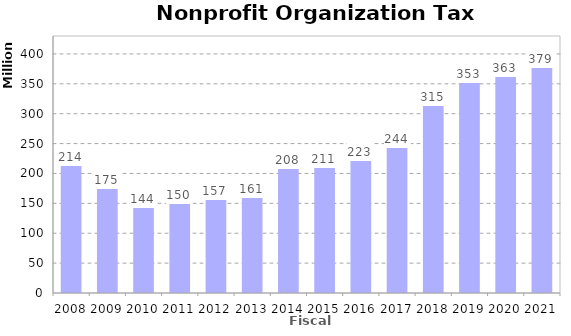
| Category | Amount ($) |
|---|---|
| 2008.0 | 213829116.386 |
| 2009.0 | 175364334.919 |
| 2010.0 | 143554116.648 |
| 2011.0 | 150273915 |
| 2012.0 | 156945693.354 |
| 2013.0 | 161434467.789 |
| 2014.0 | 208366102.088 |
| 2015.0 | 210994603.365 |
| 2016.0 | 223074819.582 |
| 2017.0 | 244370076.328 |
| 2018.0 | 314543689.447 |
| 2019.0 | 352673576.32 |
| 2020.0 | 362781521.933 |
| 2021.0 | 378603136.285 |